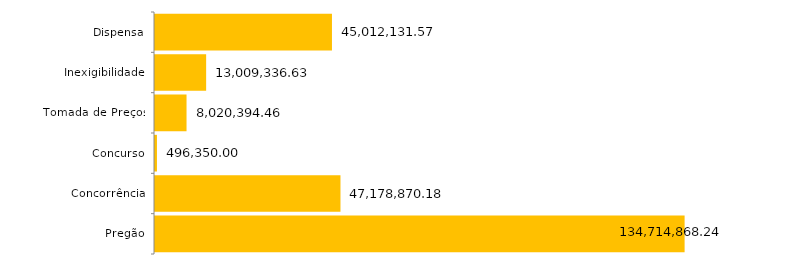
| Category | Series 0 |
|---|---|
| Pregão | 134714868.24 |
| Concorrência | 47178870.18 |
| Concurso | 496350 |
| Tomada de Preços | 8020394.46 |
| Inexigibilidade | 13009336.63 |
| Dispensa | 45012131.57 |